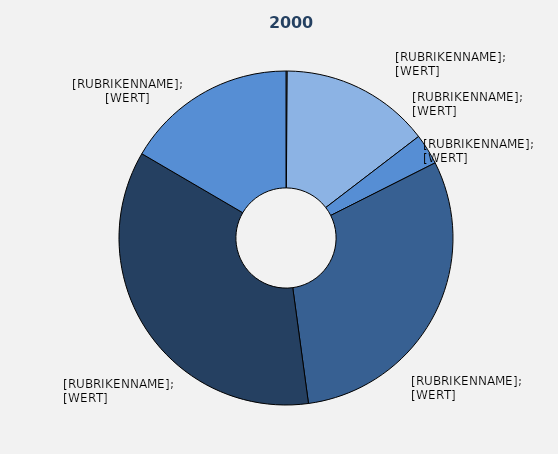
| Category | Series 1 |
|---|---|
| Land- und Forstwirtschaft, Fischerei | 0.115 |
| Produzierendes Gewerbe ohne Baugewerbe | 14.484 |
| Baugewerbe | 2.972 |
| Handel, Verkehr, Gastgewerbe, 
Information und Kommunikation | 30.279 |
| Finanz-, Versicherungs- und 
Unternehmensdienstleister, 
Grundstücks- und Wohnungswesen | 35.57 |
| Öffentliche und sonstige 
Dienstleister, Erziehung, 
Unterricht | 16.58 |